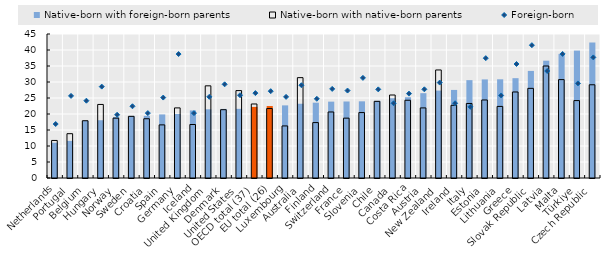
| Category | Native-born with foreign-born parents | Native-born with native-born parents |
|---|---|---|
| Netherlands | 11.015 | 11.734 |
| Portugal | 11.595 | 13.85 |
| Belgium | 17.895 | 17.899 |
| Hungary | 18.055 | 22.985 |
| Norway | 19.068 | 18.706 |
| Sweden | 19.395 | 19.268 |
| Croatia | 19.415 | 18.52 |
| Spain | 19.866 | 16.598 |
| Germany | 20.003 | 21.909 |
| Iceland | 21.112 | 16.714 |
| United Kingdom | 21.473 | 28.803 |
| Denmark | 21.592 | 21.344 |
| United States | 21.614 | 27.31 |
| OECD total (37) | 22.214 | 23.134 |
| EU total (26) | 22.485 | 21.701 |
| Luxembourg | 22.697 | 16.271 |
| Australia | 23.203 | 31.359 |
| Finland | 23.542 | 17.318 |
| Switzerland | 23.863 | 20.632 |
| France | 23.911 | 18.702 |
| Slovenia | 23.96 | 20.446 |
| Chile | 24.124 | 23.955 |
| Canada | 24.927 | 25.933 |
| Costa Rica | 25.234 | 24.3 |
| Austria | 26.508 | 21.9 |
| New Zealand | 27.318 | 33.764 |
| Ireland | 27.521 | 22.717 |
| Italy | 30.583 | 23.294 |
| Estonia | 30.81 | 24.383 |
| Lithuania | 30.849 | 22.37 |
| Greece | 31.195 | 26.882 |
| Slovak Republic | 33.466 | 28.016 |
| Latvia | 36.656 | 35.001 |
| Malta | 38.788 | 30.745 |
| Türkiye | 39.818 | 24.19 |
| Czech Republic | 42.366 | 29.135 |